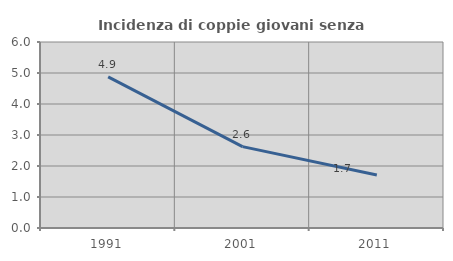
| Category | Incidenza di coppie giovani senza figli |
|---|---|
| 1991.0 | 4.875 |
| 2001.0 | 2.625 |
| 2011.0 | 1.708 |